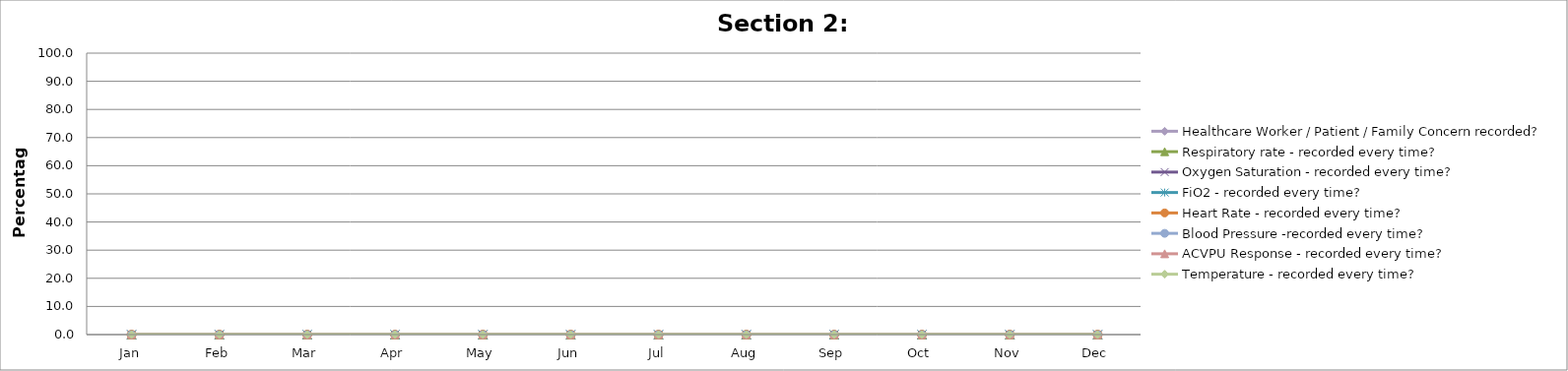
| Category | Healthcare Worker / Patient / Family Concern recorded? | Respiratory rate - recorded every time? | Oxygen Saturation - recorded every time? | FiO2 - recorded every time? | Heart Rate - recorded every time? | Blood Pressure -recorded every time?  | ACVPU Response - recorded every time? | Temperature - recorded every time? |
|---|---|---|---|---|---|---|---|---|
| Jan | 0 | 0 | 0 | 0 | 0 | 0 | 0 | 0 |
| Feb | 0 | 0 | 0 | 0 | 0 | 0 | 0 | 0 |
| Mar | 0 | 0 | 0 | 0 | 0 | 0 | 0 | 0 |
| Apr | 0 | 0 | 0 | 0 | 0 | 0 | 0 | 0 |
| May | 0 | 0 | 0 | 0 | 0 | 0 | 0 | 0 |
| Jun | 0 | 0 | 0 | 0 | 0 | 0 | 0 | 0 |
| Jul | 0 | 0 | 0 | 0 | 0 | 0 | 0 | 0 |
| Aug | 0 | 0 | 0 | 0 | 0 | 0 | 0 | 0 |
| Sep | 0 | 0 | 0 | 0 | 0 | 0 | 0 | 0 |
| Oct | 0 | 0 | 0 | 0 | 0 | 0 | 0 | 0 |
| Nov | 0 | 0 | 0 | 0 | 0 | 0 | 0 | 0 |
| Dec | 0 | 0 | 0 | 0 | 0 | 0 | 0 | 0 |